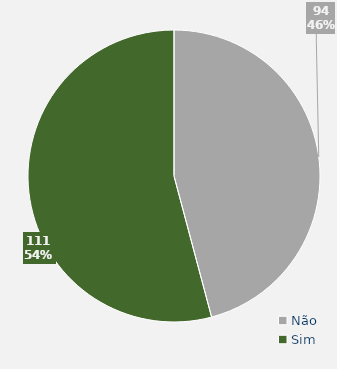
| Category | Total |
|---|---|
| Não | 94 |
| Sim | 111 |